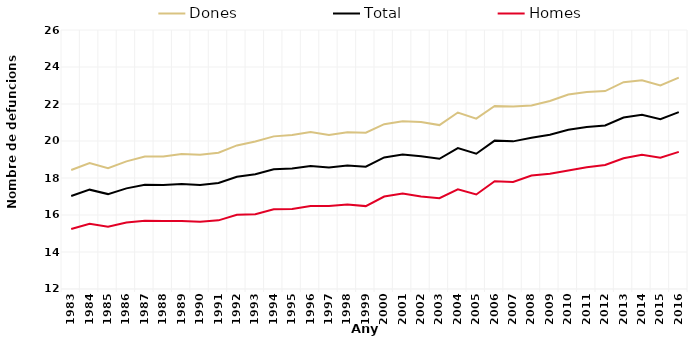
| Category | Dones | Total | Homes |
|---|---|---|---|
| 1983.0 | 18.43 | 17.03 | 15.24 |
| 1984.0 | 18.81 | 17.37 | 15.53 |
| 1985.0 | 18.53 | 17.13 | 15.36 |
| 1986.0 | 18.9 | 17.44 | 15.59 |
| 1987.0 | 19.16 | 17.63 | 15.69 |
| 1988.0 | 19.16 | 17.62 | 15.68 |
| 1989.0 | 19.3 | 17.68 | 15.68 |
| 1990.0 | 19.26 | 17.62 | 15.63 |
| 1991.0 | 19.37 | 17.73 | 15.71 |
| 1992.0 | 19.76 | 18.07 | 16.01 |
| 1993.0 | 19.97 | 18.2 | 16.04 |
| 1994.0 | 20.25 | 18.47 | 16.31 |
| 1995.0 | 20.33 | 18.51 | 16.33 |
| 1996.0 | 20.48 | 18.65 | 16.49 |
| 1997.0 | 20.33 | 18.57 | 16.49 |
| 1998.0 | 20.47 | 18.67 | 16.57 |
| 1999.0 | 20.45 | 18.61 | 16.48 |
| 2000.0 | 20.91 | 19.11 | 17 |
| 2001.0 | 21.07 | 19.27 | 17.16 |
| 2002.0 | 21.03 | 19.17 | 17 |
| 2003.0 | 20.86 | 19.04 | 16.91 |
| 2004.0 | 21.54 | 19.62 | 17.39 |
| 2005.0 | 21.21 | 19.31 | 17.11 |
| 2006.0 | 21.89 | 20.02 | 17.83 |
| 2007.0 | 21.86 | 19.98 | 17.79 |
| 2008.0 | 21.92 | 20.18 | 18.13 |
| 2009.0 | 22.16 | 20.34 | 18.23 |
| 2010.0 | 22.51 | 20.61 | 18.41 |
| 2011.0 | 22.65 | 20.76 | 18.58 |
| 2012.0 | 22.7 | 20.84 | 18.7 |
| 2013.0 | 23.18 | 21.27 | 19.07 |
| 2014.0 | 23.28 | 21.42 | 19.26 |
| 2015.0 | 23 | 21.18 | 19.1 |
| 2016.0 | 23.43 | 21.56 | 19.41 |